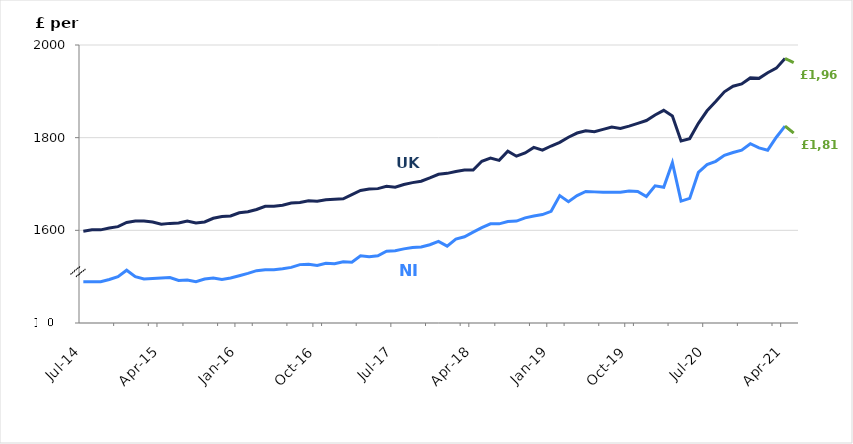
| Category | Series 0 | Series 1 |
|---|---|---|
| 2014-07-01 | 1489 | 1598 |
| 2014-08-01 | 1489 | 1601 |
| 2014-09-01 | 1489 | 1601 |
| 2014-10-01 | 1494 | 1605 |
| 2014-11-01 | 1500 | 1608 |
| 2014-12-01 | 1514 | 1617 |
| 2015-01-01 | 1500 | 1620 |
| 2015-02-01 | 1495 | 1620 |
| 2015-03-01 | 1496 | 1618 |
| 2015-04-01 | 1497 | 1613 |
| 2015-05-01 | 1498 | 1615 |
| 2015-06-01 | 1492 | 1616 |
| 2015-07-01 | 1493 | 1620 |
| 2015-08-01 | 1489 | 1616 |
| 2015-09-01 | 1495 | 1618 |
| 2015-10-01 | 1497 | 1626 |
| 2015-11-01 | 1494 | 1630 |
| 2015-12-01 | 1497 | 1631 |
| 2016-01-01 | 1502 | 1638 |
| 2016-02-01 | 1507 | 1640 |
| 2016-03-01 | 1513 | 1645 |
| 2016-04-01 | 1515 | 1652 |
| 2016-05-01 | 1515 | 1652 |
| 2016-06-01 | 1517 | 1654 |
| 2016-07-01 | 1520 | 1659 |
| 2016-08-01 | 1526 | 1660 |
| 2016-09-01 | 1527 | 1664 |
| 2016-10-01 | 1524 | 1663 |
| 2016-11-01 | 1529 | 1666 |
| 2016-12-01 | 1528 | 1667 |
| 2017-01-01 | 1532 | 1668 |
| 2017-02-01 | 1531 | 1677 |
| 2017-03-01 | 1545 | 1686 |
| 2017-04-01 | 1543 | 1689 |
| 2017-05-01 | 1545 | 1690 |
| 2017-06-01 | 1555 | 1695 |
| 2017-07-01 | 1556 | 1693 |
| 2017-08-01 | 1560 | 1699 |
| 2017-09-01 | 1563 | 1703 |
| 2017-10-01 | 1564 | 1706 |
| 2017-11-01 | 1569 | 1713 |
| 2017-12-01 | 1576 | 1721 |
| 2018-01-01 | 1566 | 1723 |
| 2018-02-01 | 1581 | 1727 |
| 2018-03-01 | 1586 | 1730 |
| 2018-04-01 | 1596 | 1730 |
| 2018-05-01 | 1606 | 1749 |
| 2018-06-01 | 1614 | 1756 |
| 2018-07-01 | 1614 | 1751 |
| 2018-08-01 | 1619 | 1771 |
| 2018-09-01 | 1620 | 1760 |
| 2018-10-01 | 1627 | 1767 |
| 2018-11-01 | 1631 | 1779 |
| 2018-12-01 | 1634 | 1773 |
| 2019-01-01 | 1641 | 1782 |
| 2019-02-01 | 1675 | 1790 |
| 2019-03-01 | 1662 | 1801 |
| 2019-04-01 | 1675 | 1810 |
| 2019-05-01 | 1684 | 1815 |
| 2019-06-01 | 1683 | 1813 |
| 2019-07-01 | 1682 | 1818 |
| 2019-08-01 | 1682 | 1823 |
| 2019-09-01 | 1682 | 1820 |
| 2019-10-01 | 1685 | 1825 |
| 2019-11-01 | 1684 | 1831 |
| 2019-12-01 | 1673 | 1837 |
| 2020-01-01 | 1696 | 1849 |
| 2020-02-01 | 1693 | 1859 |
| 2020-03-01 | 1746 | 1847 |
| 2020-04-01 | 1663 | 1793 |
| 2020-05-01 | 1669 | 1798 |
| 2020-06-01 | 1725 | 1831 |
| 2020-07-01 | 1742 | 1858 |
| 2020-08-01 | 1749 | 1878 |
| 2020-09-01 | 1762 | 1899 |
| 2020-10-01 | 1768 | 1911 |
| 2020-11-01 | 1773 | 1916 |
| 2020-12-01 | 1787 | 1929 |
| 2021-01-01 | 1778 | 1928 |
| 2021-02-01 | 1773 | 1940 |
| 2021-03-01 | 1801 | 1950 |
| 2021-04-01 | 1825 | 1971 |
| 2021-05-01 | 1810 | 1962 |